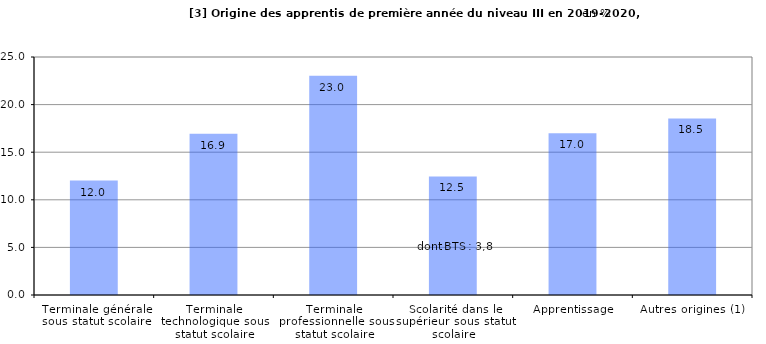
| Category | Series 0 |
|---|---|
| Terminale générale sous statut scolaire | 12.02 |
| Terminale technologique sous statut scolaire | 16.94 |
| Terminale professionnelle sous statut scolaire | 23.04 |
| Scolarité dans le supérieur sous statut scolaire | 12.46 |
| Apprentissage | 17 |
| Autres origines (1) | 18.54 |